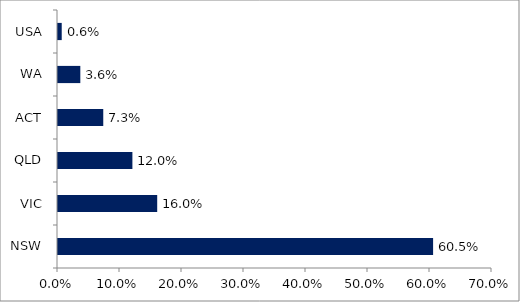
| Category | Series 0 |
|---|---|
| NSW | 0.605 |
| VIC | 0.16 |
| QLD | 0.12 |
| ACT | 0.073 |
| WA | 0.036 |
| USA | 0.006 |